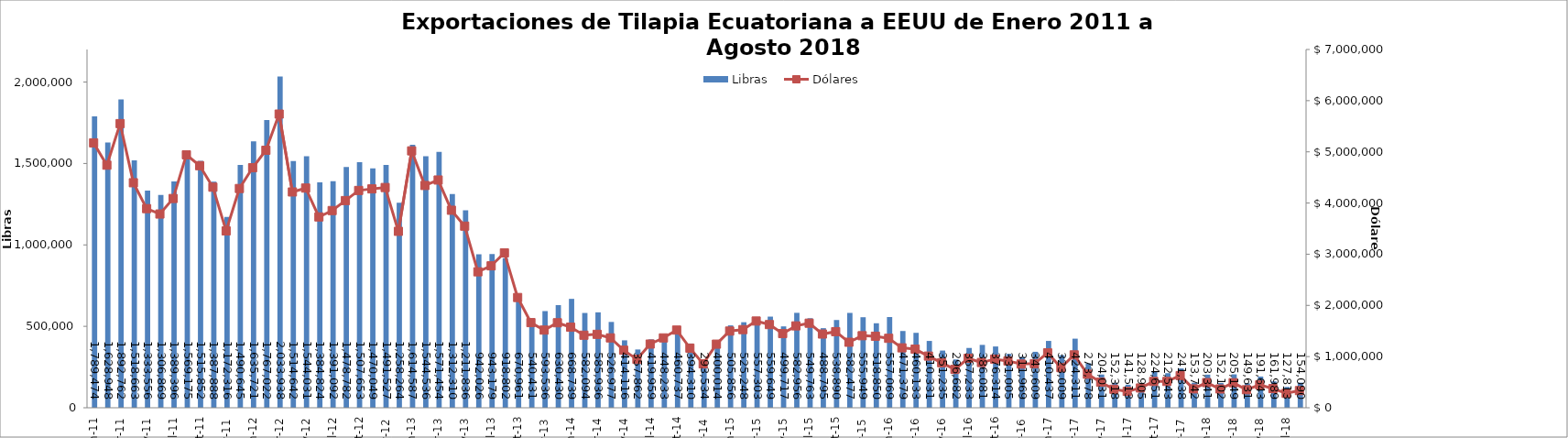
| Category | Libras  |
|---|---|
| 2011-01-01 | 1789473.82 |
| 2011-02-01 | 1628948.076 |
| 2011-03-01 | 1892761.535 |
| 2011-04-01 | 1518662.961 |
| 2011-05-01 | 1333555.926 |
| 2011-06-01 | 1306869.243 |
| 2011-07-01 | 1389396.24 |
| 2011-08-01 | 1569174.756 |
| 2011-09-01 | 1515852.096 |
| 2011-10-01 | 1387888.293 |
| 2011-11-01 | 1172315.891 |
| 2011-12-01 | 1490644.699 |
| 2012-01-01 | 1635720.607 |
| 2012-02-01 | 1767022.174 |
| 2012-03-01 | 2033937.505 |
| 2012-04-01 | 1514641.77 |
| 2012-05-01 | 1544031.293 |
| 2012-06-01 | 1384823.899 |
| 2012-07-01 | 1391091.577 |
| 2012-08-01 | 1478781.747 |
| 2012-09-01 | 1507653.188 |
| 2012-10-01 | 1470049.326 |
| 2012-11-01 | 1491526.539 |
| 2012-12-01 | 1258264 |
| 2013-01-01 | 1614587 |
| 2013-02-01 | 1544536.146 |
| 2013-03-01 | 1571454.312 |
| 2013-04-01 | 1312310.196 |
| 2013-05-01 | 1211835.551 |
| 2013-06-01 | 942025.58 |
| 2013-07-01 | 943178.586 |
| 2013-08-01 | 918802.324 |
| 2013-09-01 | 670961.192 |
| 2013-10-01 | 540431.235 |
| 2013-11-01 | 593535.64 |
| 2013-12-01 | 630429.621 |
| 2014-01-01 | 668739 |
| 2014-02-01 | 582093.766 |
| 2014-03-01 | 585936.383 |
| 2014-04-01 | 526976.561 |
| 2014-05-01 | 414116.473 |
| 2014-06-01 | 357861.695 |
| 2014-07-01 | 419958.663 |
| 2014-08-01 | 448233 |
| 2014-09-01 | 460737.149 |
| 2014-10-01 | 394310.347 |
| 2014-11-01 | 293533.672 |
| 2014-12-01 | 400013.647 |
| 2015-01-01 | 505856.493 |
| 2015-02-01 | 525248 |
| 2015-03-01 | 557303.039 |
| 2015-04-01 | 559648.733 |
| 2015-05-01 | 499716.682 |
| 2015-06-01 | 582955.764 |
| 2015-07-01 | 549763.307 |
| 2015-08-01 | 488795.094 |
| 2015-09-01 | 538890.219 |
| 2015-10-01 | 582477.366 |
| 2015-11-01 | 555949.414 |
| 2015-12-01 | 518850.405 |
| 2016-01-01 | 557069.351 |
| 2016-02-01 | 471378.754 |
| 2016-03-01 | 460133.089 |
| 2016-04-01 | 410331.175 |
| 2016-05-01 | 351235 |
| 2016-06-01 | 296682 |
| 2016-07-01 | 367233.45 |
| 2016-08-01 | 386080.575 |
| 2016-09-01 | 376314.197 |
| 2016-10-01 | 331005.258 |
| 2016-11-01 | 311968.537 |
| 2016-12-01 | 343608.956 |
| 2017-01-01 | 410436.996 |
| 2017-02-01 | 323009.174 |
| 2017-03-01 | 424310.544 |
| 2017-04-01 | 273577.632 |
| 2017-05-01 | 204031.321 |
| 2017-06-01 | 152318.019 |
| 2017-07-01 | 141513.274 |
| 2017-08-01 | 128905.167 |
| 2017-09-01 | 224650.945 |
| 2017-10-01 | 212543.281 |
| 2017-11-01 | 241337.562 |
| 2017-12-01 | 153742.19 |
| 2018-01-01 | 203341.281 |
| 2018-02-01 | 152101.968 |
| 2018-03-01 | 205149.053 |
| 2018-04-01 | 149630.611 |
| 2018-05-01 | 191643 |
| 2018-06-01 | 161989 |
| 2018-07-01 | 127813 |
| 2018-08-01 | 154089.894 |